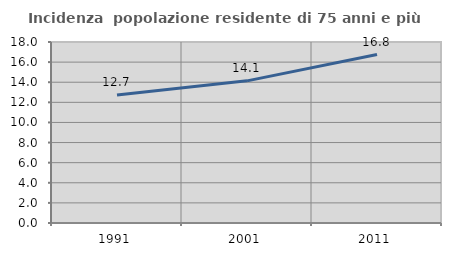
| Category | Incidenza  popolazione residente di 75 anni e più |
|---|---|
| 1991.0 | 12.736 |
| 2001.0 | 14.136 |
| 2011.0 | 16.75 |